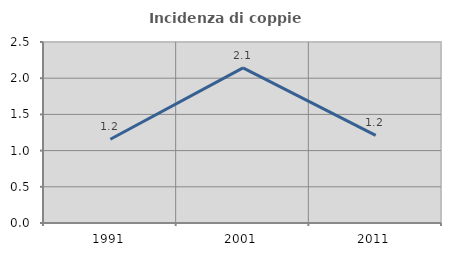
| Category | Incidenza di coppie miste |
|---|---|
| 1991.0 | 1.156 |
| 2001.0 | 2.143 |
| 2011.0 | 1.21 |